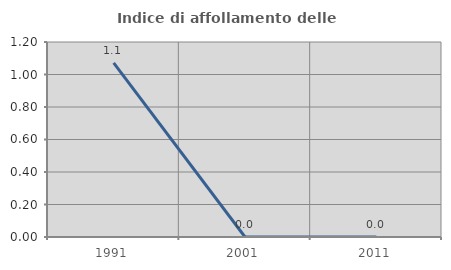
| Category | Indice di affollamento delle abitazioni  |
|---|---|
| 1991.0 | 1.071 |
| 2001.0 | 0 |
| 2011.0 | 0 |